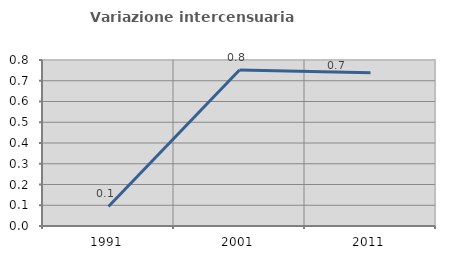
| Category | Variazione intercensuaria annua |
|---|---|
| 1991.0 | 0.094 |
| 2001.0 | 0.752 |
| 2011.0 | 0.738 |